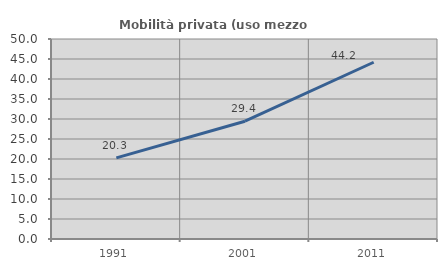
| Category | Mobilità privata (uso mezzo privato) |
|---|---|
| 1991.0 | 20.27 |
| 2001.0 | 29.442 |
| 2011.0 | 44.186 |